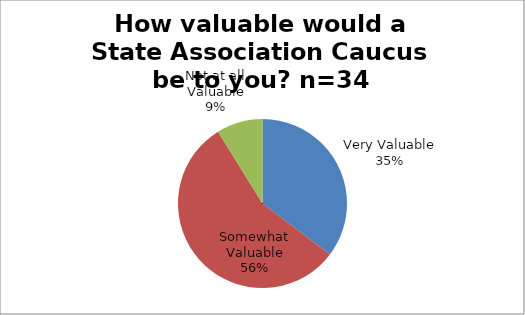
| Category | How valuable would a State Association Caucus be to you? |
|---|---|
| Very Valuable | 12 |
| Somewhat Valuable | 19 |
| Not at all Valuable | 3 |